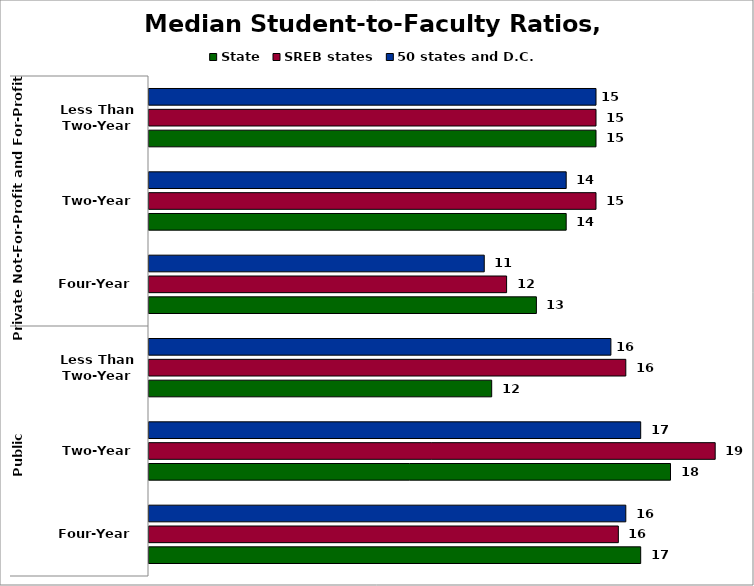
| Category | State | SREB states | 50 states and D.C. |
|---|---|---|---|
| 0 | 16.5 | 15.75 | 16 |
| 1 | 17.5 | 19 | 16.5 |
| 2 | 11.5 | 16 | 15.5 |
| 3 | 13 | 12 | 11.25 |
| 4 | 14 | 15 | 14 |
| 5 | 15 | 15 | 15 |